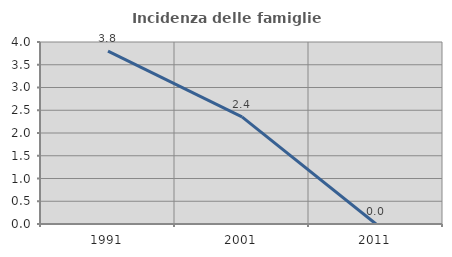
| Category | Incidenza delle famiglie numerose |
|---|---|
| 1991.0 | 3.797 |
| 2001.0 | 2.353 |
| 2011.0 | 0 |